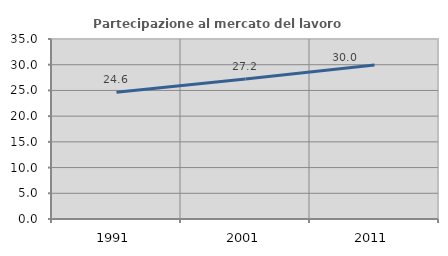
| Category | Partecipazione al mercato del lavoro  femminile |
|---|---|
| 1991.0 | 24.628 |
| 2001.0 | 27.202 |
| 2011.0 | 29.952 |